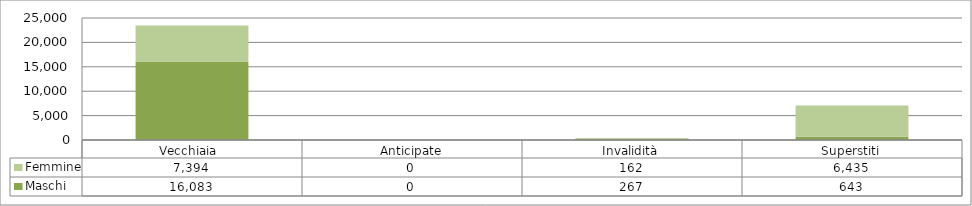
| Category | Maschi | Femmine |
|---|---|---|
| Vecchiaia  | 16083 | 7394 |
| Anticipate | 0 | 0 |
| Invalidità | 267 | 162 |
| Superstiti | 643 | 6435 |